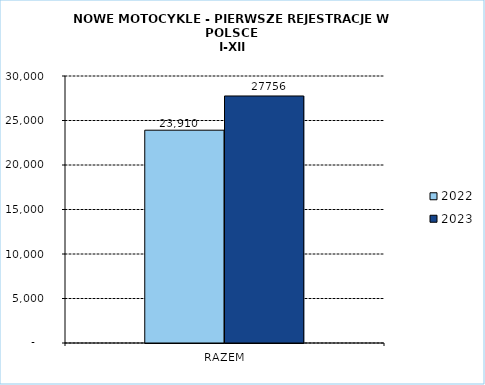
| Category | 2022 | 2023 |
|---|---|---|
| RAZEM | 23910 | 27756 |